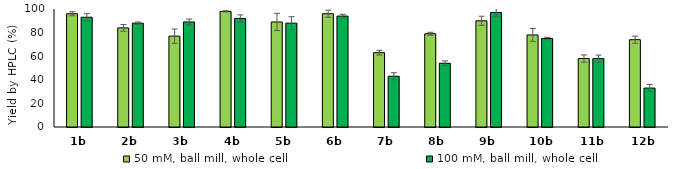
| Category | 50 mM, ball mill, whole cell | 100 mM, ball mill, whole cell |
|---|---|---|
| 1b | 96 | 93 |
| 2b | 84 | 88 |
| 3b | 77 | 89 |
| 4b | 98 | 92 |
| 5b | 89 | 88 |
| 6b | 96 | 94 |
| 7b | 63 | 43 |
| 8b | 79 | 54 |
| 9b | 90 | 97 |
| 10b | 78 | 75 |
| 11b | 58 | 58 |
| 12b | 74 | 33 |